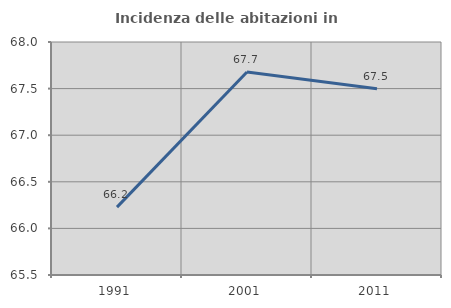
| Category | Incidenza delle abitazioni in proprietà  |
|---|---|
| 1991.0 | 66.228 |
| 2001.0 | 67.679 |
| 2011.0 | 67.498 |